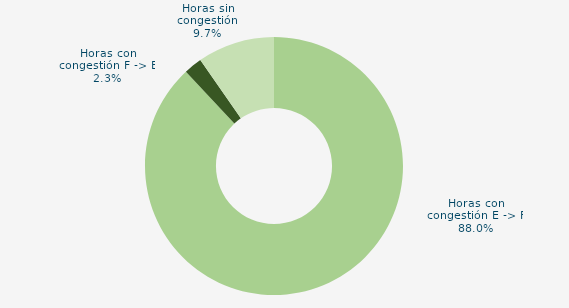
| Category | Horas con congestión E -> F |
|---|---|
| Horas con congestión E -> F | 88.038 |
| Horas con congestión F -> E | 2.285 |
| Horas sin congestión | 9.677 |